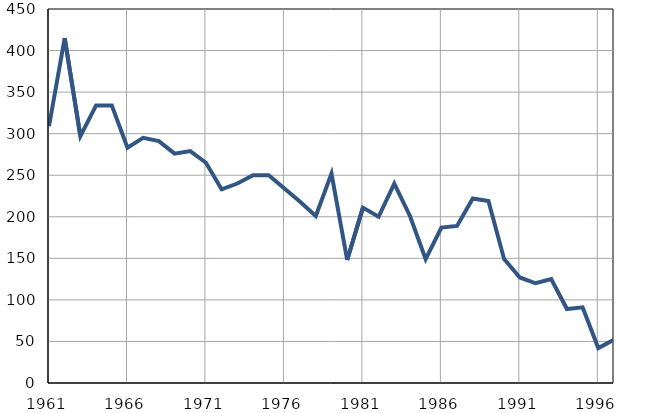
| Category | Умрла 
одојчад |
|---|---|
| 1961.0 | 309 |
| 1962.0 | 415 |
| 1963.0 | 297 |
| 1964.0 | 334 |
| 1965.0 | 334 |
| 1966.0 | 283 |
| 1967.0 | 295 |
| 1968.0 | 291 |
| 1969.0 | 276 |
| 1970.0 | 279 |
| 1971.0 | 265 |
| 1972.0 | 233 |
| 1973.0 | 240 |
| 1974.0 | 250 |
| 1975.0 | 250 |
| 1976.0 | 234 |
| 1977.0 | 218 |
| 1978.0 | 201 |
| 1979.0 | 252 |
| 1980.0 | 148 |
| 1981.0 | 211 |
| 1982.0 | 200 |
| 1983.0 | 240 |
| 1984.0 | 201 |
| 1985.0 | 149 |
| 1986.0 | 187 |
| 1987.0 | 189 |
| 1988.0 | 222 |
| 1989.0 | 219 |
| 1990.0 | 149 |
| 1991.0 | 127 |
| 1992.0 | 120 |
| 1993.0 | 125 |
| 1994.0 | 89 |
| 1995.0 | 91 |
| 1996.0 | 42 |
| 1997.0 | 52 |